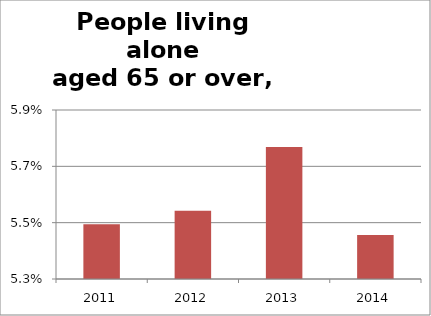
| Category | Series 1 |
|---|---|
| 2011.0 | 0.055 |
| 2012.0 | 0.055 |
| 2013.0 | 0.057 |
| 2014.0 | 0.054 |